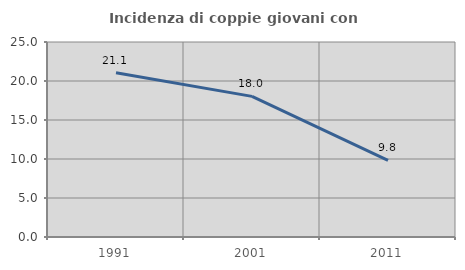
| Category | Incidenza di coppie giovani con figli |
|---|---|
| 1991.0 | 21.067 |
| 2001.0 | 18.029 |
| 2011.0 | 9.817 |